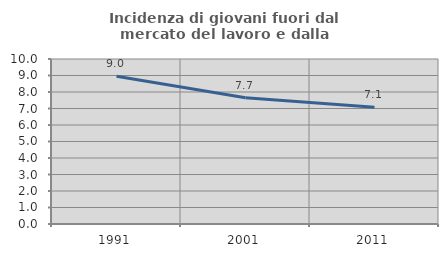
| Category | Incidenza di giovani fuori dal mercato del lavoro e dalla formazione  |
|---|---|
| 1991.0 | 8.951 |
| 2001.0 | 7.656 |
| 2011.0 | 7.075 |